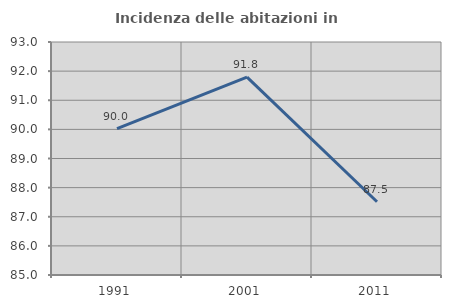
| Category | Incidenza delle abitazioni in proprietà  |
|---|---|
| 1991.0 | 90.029 |
| 2001.0 | 91.792 |
| 2011.0 | 87.516 |